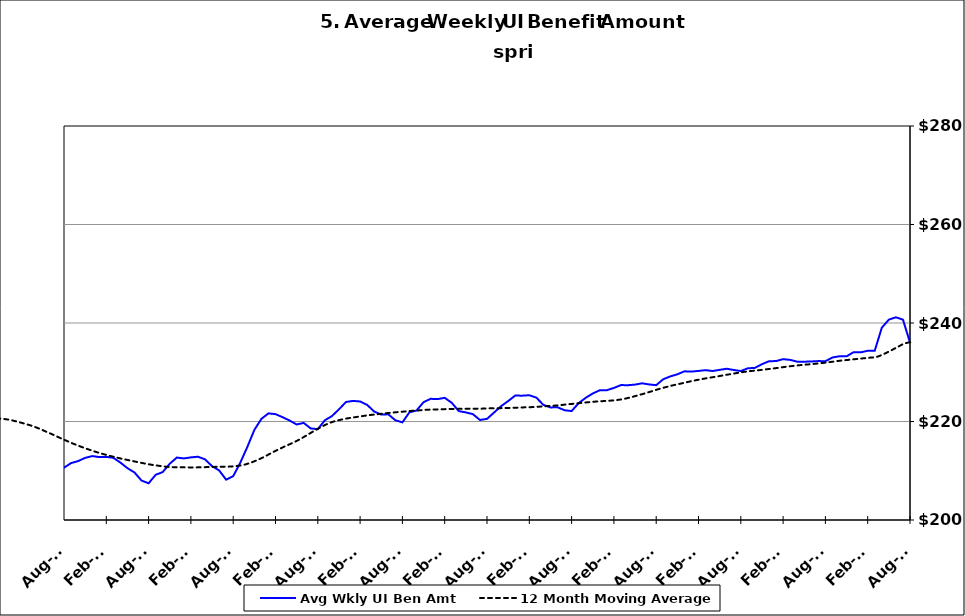
| Category | Avg Wkly UI Ben Amt |
|---|---|
| 1995-01-31 | 152.517 |
| 1995-02-28 | 151.164 |
| 1995-03-31 | 148.4 |
| 1995-04-30 | 146.034 |
| 1995-05-31 | 146.738 |
| 1995-06-30 | 147.885 |
| 1995-07-31 | 145.798 |
| 1995-08-31 | 144.052 |
| 1995-09-30 | 147.334 |
| 1995-10-31 | 151.535 |
| 1995-11-30 | 152.903 |
| 1995-12-31 | 153.258 |
| 1996-01-15 | 153.468 |
| 1996-02-15 | 153.032 |
| 1996-03-15 | 155.453 |
| 1996-04-15 | 148.614 |
| 1996-05-15 | 148.648 |
| 1996-06-15 | 150.145 |
| 1996-07-15 | 147.052 |
| 1996-08-15 | 146.042 |
| 1996-09-15 | 149.978 |
| 1996-10-15 | 151.319 |
| 1996-11-15 | 153.295 |
| 1996-12-15 | 155.775 |
| 1997-01-15 | 154.813 |
| 1997-02-15 | 151.102 |
| 1997-03-15 | 149.222 |
| 1997-04-15 | 145.178 |
| 1997-05-31 | 145.194 |
| 1997-06-30 | 146.718 |
| 1997-07-31 | 142.224 |
| 1997-08-31 | 142.382 |
| 1997-09-30 | 143.123 |
| 1997-10-31 | 146.797 |
| 1997-11-30 | 148.163 |
| 1997-12-31 | 147.967 |
| 1998-01-31 | 147.87 |
| 1998-02-28 | 147.591 |
| 1998-03-31 | 147.262 |
| 1998-04-30 | 144.746 |
| 1998-05-31 | 146.093 |
| 1998-06-30 | 147.355 |
| 1998-07-31 | 146.079 |
| 1998-08-31 | 147.387 |
| 1998-09-30 | 147.529 |
| 1998-10-31 | 152.825 |
| 1998-11-30 | 156.171 |
| 1998-12-31 | 156.424 |
| 1999-01-31 | 157.388 |
| 1999-02-28 | 157.868 |
| 1999-03-31 | 157.505 |
| 1999-04-30 | 153.987 |
| 1999-05-31 | 153.665 |
| 1999-06-30 | 153.746 |
| 1999-07-31 | 154.09 |
| 1999-08-31 | 156.162 |
| 1999-09-30 | 157.136 |
| 1999-10-31 | 162.476 |
| 1999-11-30 | 163.291 |
| 1999-12-31 | 165.621 |
| 2000-01-31 | 166.425 |
| 2000-02-29 | 165.378 |
| 2000-03-31 | 163.05 |
| 2000-04-30 | 161.908 |
| 2000-05-31 | 160.484 |
| 2000-06-30 | 160.865 |
| 2000-07-31 | 161.011 |
| 2000-08-31 | 158.845 |
| 2000-09-30 | 161.127 |
| 2000-10-31 | 163.997 |
| 2000-11-30 | 164.759 |
| 2000-12-31 | 166.66 |
| 2001-01-31 | 168.164 |
| 2001-02-28 | 169.339 |
| 2001-03-31 | 169.617 |
| 2001-04-30 | 170.349 |
| 2001-05-31 | 168.417 |
| 2001-06-30 | 169.418 |
| 2001-07-31 | 169.733 |
| 2001-08-31 | 170.578 |
| 2001-09-30 | 174.36 |
| 2001-10-31 | 176.952 |
| 2001-11-30 | 178.489 |
| 2001-12-31 | 179.805 |
| 2002-01-31 | 179.529 |
| 2002-02-28 | 179.269 |
| 2002-03-31 | 178.588 |
| 2002-04-30 | 177.594 |
| 2002-05-31 | 175.021 |
| 2002-06-30 | 175.298 |
| 2002-07-31 | 173.853 |
| 2002-08-31 | 172.776 |
| 2002-09-30 | 174.657 |
| 2002-10-31 | 175.648 |
| 2002-11-30 | 176.299 |
| 2002-12-31 | 177.239 |
| 2003-01-31 | 176.943 |
| 2003-02-28 | 176.988 |
| 2003-03-31 | 175.698 |
| 2003-04-30 | 172.857 |
| 2003-05-31 | 171.934 |
| 2003-06-30 | 171.956 |
| 2003-07-31 | 170.949 |
| 2003-08-31 | 171.311 |
| 2003-09-30 | 171.909 |
| 2003-10-31 | 172.692 |
| 2003-11-30 | 173.689 |
| 2003-12-31 | 174.176 |
| 2004-01-31 | 173.867 |
| 2004-02-29 | 173.648 |
| 2004-03-31 | 172.152 |
| 2004-04-30 | 170.705 |
| 2004-05-31 | 170.684 |
| 2004-06-30 | 170.635 |
| 2004-07-31 | 171.229 |
| 2004-08-31 | 175.375 |
| 2004-09-30 | 182.737 |
| 2004-10-31 | 187.554 |
| 2004-11-30 | 191.316 |
| 2004-12-31 | 194.602 |
| 2005-01-31 | 196.38 |
| 2005-02-28 | 196.569 |
| 2005-03-31 | 195.523 |
| 2005-04-30 | 193.655 |
| 2005-05-31 | 193.953 |
| 2005-06-30 | 192.728 |
| 2005-07-31 | 192.211 |
| 2005-08-31 | 191.133 |
| 2005-09-30 | 194.339 |
| 2005-10-31 | 196.819 |
| 2005-11-30 | 198.473 |
| 2005-12-31 | 199.545 |
| 2006-01-31 | 199.965 |
| 2006-02-28 | 200.117 |
| 2006-03-31 | 198.335 |
| 2006-04-30 | 197.258 |
| 2006-05-31 | 195.225 |
| 2006-06-30 | 195.734 |
| 2006-07-31 | 194.92 |
| 2006-08-31 | 194.282 |
| 2006-09-30 | 196.801 |
| 2006-10-31 | 199.137 |
| 2006-11-30 | 201.183 |
| 2006-12-31 | 202.121 |
| 2007-01-31 | 202.615 |
| 2007-02-28 | 202.465 |
| 2007-03-31 | 201.75 |
| 2007-04-30 | 200.344 |
| 2007-05-31 | 198.851 |
| 2007-06-30 | 198.258 |
| 2007-07-30 | 197.654 |
| 2007-08-31 | 198.405 |
| 2007-09-30 | 200.563 |
| 2007-10-31 | 201.857 |
| 2007-11-15 | 203.345 |
| 2007-12-15 09:36:00 | 219.243 |
| 2008-01-14 19:12:00 | 219.658 |
| 2008-02-14 04:48:00 | 220.121 |
| 2008-03-15 14:24:00 | 219.456 |
| 2008-04-15 | 217.672 |
| 2008-05-15 09:36:00 | 216.637 |
| 2008-06-14 19:12:00 | 216.035 |
| 2008-07-15 04:48:00 | 213.916 |
| 2008-08-14 14:24:00 | 214.008 |
| 2008-09-14 | 216.475 |
| 2008-10-14 09:36:00 | 217.836 |
| 2008-11-13 19:12:00 | 219.819 |
| 2008-12-14 04:48:00 | 221.529 |
| 2009-01-13 14:24:00 | 222.143 |
| 2009-02-13 | 222.091 |
| 2009-03-15 09:36:00 | 222.273 |
| 2009-04-14 19:12:00 | 222.011 |
| 2009-05-15 04:48:00 | 221.558 |
| 2009-06-14 14:24:00 | 220.761 |
| 2009-07-15 | 219.225 |
| 2009-08-14 09:36:00 | 218.364 |
| 2009-09-13 19:12:00 | 218.814 |
| 2009-10-14 04:48:00 | 218.744 |
| 2009-11-13 14:24:00 | 218.719 |
| 2009-12-14 | 218.779 |
| 2010-01-13 09:36:00 | 217.988 |
| 2010-02-12 19:12:00 | 217.521 |
| 2010-03-15 04:48:00 | 216.93 |
| 2010-04-14 14:24:00 | 215.638 |
| 2010-05-15 | 213.953 |
| 2010-06-14 09:36:00 | 213.326 |
| 2010-07-14 19:12:00 | 211.48 |
| 2010-08-14 04:48:00 | 210.615 |
| 2010-09-13 14:24:00 | 211.554 |
| 2010-10-14 | 211.956 |
| 2010-11-13 09:36:00 | 212.619 |
| 2010-12-13 19:12:00 | 212.979 |
| 2011-01-13 04:48:00 | 212.778 |
| 2011-02-12 14:24:00 | 212.812 |
| 2011-03-15 | 212.631 |
| 2011-04-14 09:36:00 | 211.659 |
| 2011-05-14 19:12:00 | 210.522 |
| 2011-06-14 04:48:00 | 209.652 |
| 2011-07-14 14:24:00 | 208.005 |
| 2011-08-14 | 207.451 |
| 2011-09-13 09:36:00 | 209.173 |
| 2011-10-13 19:12:00 | 209.736 |
| 2011-11-13 04:48:00 | 211.422 |
| 2011-12-13 14:24:00 | 212.679 |
| 2012-01-13 | 212.502 |
| 2012-02-12 09:36:00 | 212.715 |
| 2012-03-13 19:12:00 | 212.846 |
| 2012-04-13 04:48:00 | 212.323 |
| 2012-05-13 14:24:00 | 210.934 |
| 2012-06-13 | 210.073 |
| 2012-07-13 09:36:00 | 208.192 |
| 2012-08-12 19:12:00 | 208.902 |
| 2012-09-12 04:48:00 | 211.616 |
| 2012-10-12 14:24:00 | 214.814 |
| 2012-11-12 | 218.296 |
| 2012-12-12 09:36:00 | 220.532 |
| 2013-01-11 19:12:00 | 221.653 |
| 2013-02-11 04:48:00 | 221.49 |
| 2013-03-13 14:24:00 | 220.877 |
| 2013-04-13 | 220.198 |
| 2013-05-13 09:36:00 | 219.395 |
| 2013-06-12 19:12:00 | 219.716 |
| 2013-07-13 04:48:00 | 218.588 |
| 2013-08-12 14:24:00 | 218.444 |
| 2013-09-12 | 220.248 |
| 2013-10-12 09:36:00 | 221.094 |
| 2013-11-11 19:12:00 | 222.471 |
| 2013-12-12 04:48:00 | 223.964 |
| 2014-01-11 14:24:00 | 224.183 |
| 2014-02-11 | 224.065 |
| 2014-03-13 09:36:00 | 223.376 |
| 2014-04-12 19:12:00 | 222.017 |
| 2014-05-13 04:48:00 | 221.409 |
| 2014-06-12 14:24:00 | 221.458 |
| 2014-07-13 | 220.256 |
| 2014-08-12 09:36:00 | 219.823 |
| 2014-09-11 19:12:00 | 221.87 |
| 2014-10-12 04:48:00 | 222.223 |
| 2014-11-11 14:24:00 | 223.919 |
| 2014-12-12 | 224.606 |
| 2015-01-11 09:36:00 | 224.554 |
| 2015-02-10 19:12:00 | 224.808 |
| 2015-03-13 04:48:00 | 223.795 |
| 2015-04-12 14:24:00 | 222.11 |
| 2015-05-13 | 221.845 |
| 2015-06-12 09:36:00 | 221.492 |
| 2015-07-12 19:12:00 | 220.308 |
| 2015-08-12 04:48:00 | 220.534 |
| 2015-09-11 14:24:00 | 221.819 |
| 2015-10-12 | 223.117 |
| 2015-11-11 09:36:00 | 224.146 |
| 2015-12-11 19:12:00 | 225.264 |
| 2016-01-11 04:48:00 | 225.247 |
| 2016-02-10 14:24:00 | 225.331 |
| 2016-03-12 | 224.849 |
| 2016-04-11 09:36:00 | 223.376 |
| 2016-05-11 19:12:00 | 222.856 |
| 2016-06-11 04:48:00 | 222.895 |
| 2016-07-11 14:24:00 | 222.285 |
| 2016-08-11 | 222.119 |
| 2016-09-10 09:36:00 | 223.72 |
| 2016-10-10 19:12:00 | 224.805 |
| 2016-11-10 04:48:00 | 225.687 |
| 2016-12-10 14:24:00 | 226.349 |
| 2017-01-10 | 226.348 |
| 2017-02-09 09:36:00 | 226.816 |
| 2017-03-11 19:12:00 | 227.395 |
| 2017-04-11 04:48:00 | 227.37 |
| 2017-05-11 14:24:00 | 227.492 |
| 2017-06-11 | 227.755 |
| 2017-07-11 09:36:00 | 227.522 |
| 2017-08-10 19:12:00 | 227.382 |
| 2017-09-10 04:48:00 | 228.581 |
| 2017-10-10 14:24:00 | 229.154 |
| 2017-11-10 | 229.58 |
| 2017-12-10 09:36:00 | 230.186 |
| 2018-01-09 19:12:00 | 230.136 |
| 2018-02-09 04:48:00 | 230.265 |
| 2018-03-11 14:24:00 | 230.427 |
| 2018-04-11 | 230.25 |
| 2018-05-11 09:36:00 | 230.487 |
| 2018-06-10 19:12:00 | 230.714 |
| 2018-07-11 04:48:00 | 230.457 |
| 2018-08-10 14:24:00 | 230.244 |
| 2018-09-10 | 230.802 |
| 2018-10-10 09:36:00 | 230.887 |
| 2018-11-09 19:12:00 | 231.636 |
| 2018-12-10 04:48:00 | 232.24 |
| 2019-01-09 14:24:00 | 232.268 |
| 2019-02-09 | 232.662 |
| 2019-03-11 09:36:00 | 232.508 |
| 2019-04-10 19:12:00 | 232.152 |
| 2019-05-11 04:48:00 | 232.145 |
| 2019-06-10 14:24:00 | 232.186 |
| 2019-07-11 | 232.27 |
| 2019-08-10 09:36:00 | 232.238 |
| 2019-09-09 19:12:00 | 232.999 |
| 2019-10-10 04:48:00 | 233.25 |
| 2019-11-09 14:24:00 | 233.231 |
| 2019-12-10 | 234.074 |
| 2020-01-09 09:36:00 | 234.041 |
| 2020-02-08 19:12:00 | 234.352 |
| 2020-03-10 04:48:00 | 234.377 |
| 2020-04-09 14:24:00 | 239.041 |
| 2020-05-10 | 240.685 |
| 2020-06-09 09:36:00 | 241.153 |
| 2020-07-09 19:12:00 | 240.685 |
| 2020-08-09 04:48:00 | 236.032 |